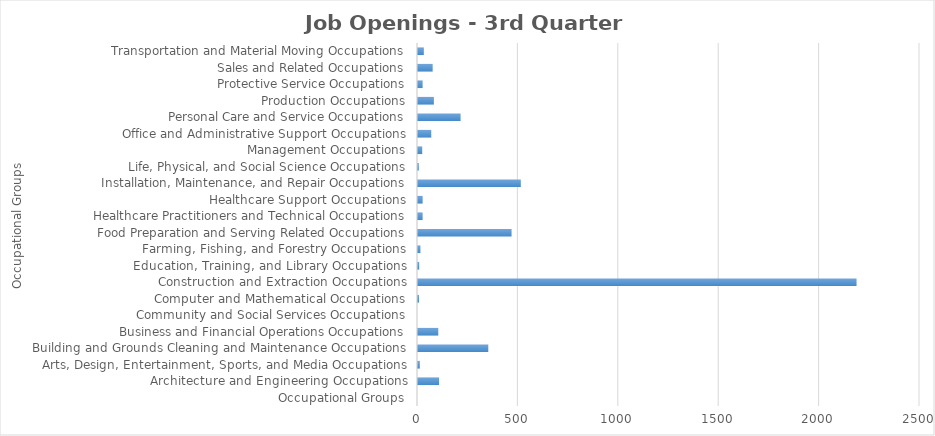
| Category | Series1 |
|---|---|
| Occupational Groups | 0 |
| Architecture and Engineering Occupations | 105 |
| Arts, Design, Entertainment, Sports, and Media Occupations | 9 |
| Building and Grounds Cleaning and Maintenance Occupations | 350 |
| Business and Financial Operations Occupations | 101 |
| Community and Social Services Occupations | 0 |
| Computer and Mathematical Occupations | 5 |
| Construction and Extraction Occupations | 2184 |
| Education, Training, and Library Occupations | 6 |
| Farming, Fishing, and Forestry Occupations | 12 |
| Food Preparation and Serving Related Occupations | 466 |
| Healthcare Practitioners and Technical Occupations | 23 |
| Healthcare Support Occupations | 23 |
| Installation, Maintenance, and Repair Occupations | 512 |
| Life, Physical, and Social Science Occupations | 4 |
| Management Occupations | 21 |
| Office and Administrative Support Occupations | 66 |
| Personal Care and Service Occupations | 212 |
| Production Occupations | 79 |
| Protective Service Occupations | 23 |
| Sales and Related Occupations | 73 |
| Transportation and Material Moving Occupations | 29 |